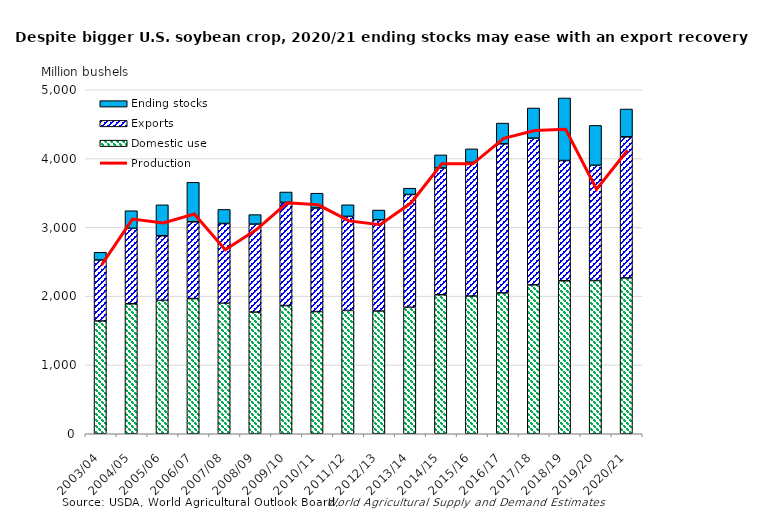
| Category | Domestic use | Exports | Ending stocks |
|---|---|---|---|
| 2003/04 | 1638.771 | 886.551 | 112.414 |
| 2004/05 | 1888.887 | 1097.156 | 255.738 |
| 2005/06 | 1938.247 | 939.879 | 449.326 |
| 2006/07 | 1964.78 | 1116.496 | 573.81 |
| 2007/08 | 1896.935 | 1158.829 | 205.034 |
| 2008/09 | 1767.813 | 1279.294 | 138.198 |
| 2009/10 | 1863.784 | 1499.048 | 150.885 |
| 2010/11 | 1776.649 | 1504.978 | 215.013 |
| 2011/12 | 1792.619 | 1366.335 | 169.37 |
| 2012/13 | 1783.847 | 1327.526 | 140.557 |
| 2013/14 | 1838.788 | 1638.559 | 91.991 |
| 2014/15 | 2020.501 | 1842.175 | 190.61 |
| 2015/16 | 2001.595 | 1942.606 | 196.729 |
| 2016/17 | 2047.399 | 2166.512 | 301.595 |
| 2017/18 | 2163.203 | 2133.73 | 438.105 |
| 2018/19 | 2223.6 | 1747.672 | 909.052 |
| 2019/20 | 2227 | 1675 | 580 |
| 2020/21 | 2265 | 2050 | 405 |